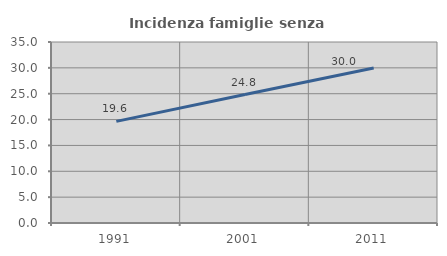
| Category | Incidenza famiglie senza nuclei |
|---|---|
| 1991.0 | 19.648 |
| 2001.0 | 24.831 |
| 2011.0 | 29.956 |